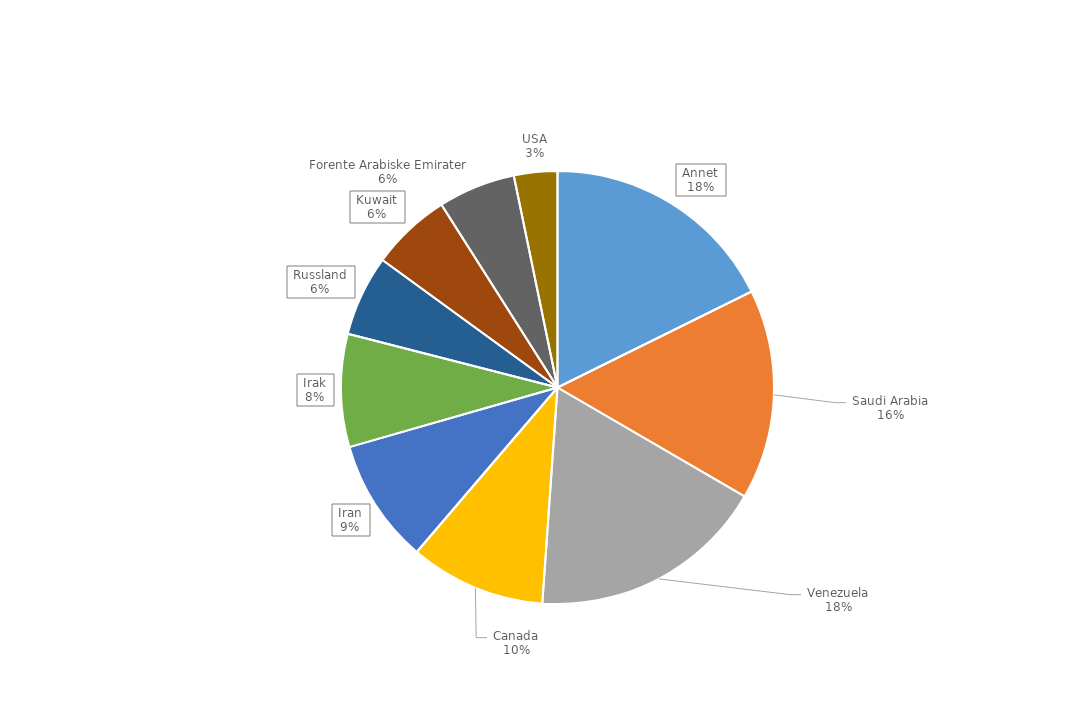
| Category | % av total |
|---|---|
| Annet | 0.177 |
| Saudi Arabia | 0.157 |
| Venezuela | 0.177 |
| Canada | 0.101 |
| Iran | 0.093 |
| Irak | 0.084 |
| Russland | 0.06 |
| Kuwait | 0.06 |
| Forente Arabiske Emirater | 0.058 |
| USA | 0.032 |